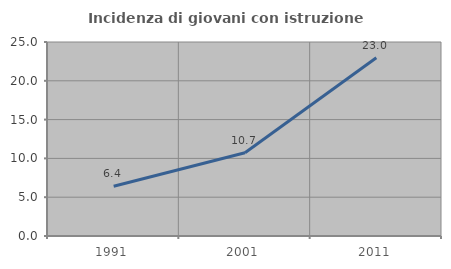
| Category | Incidenza di giovani con istruzione universitaria |
|---|---|
| 1991.0 | 6.412 |
| 2001.0 | 10.72 |
| 2011.0 | 22.967 |